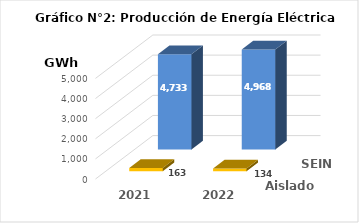
| Category | Aislados | SEIN |
|---|---|---|
| 2021.0 | 163.012 | 4733.348 |
| 2022.0 | 134.114 | 4967.756 |